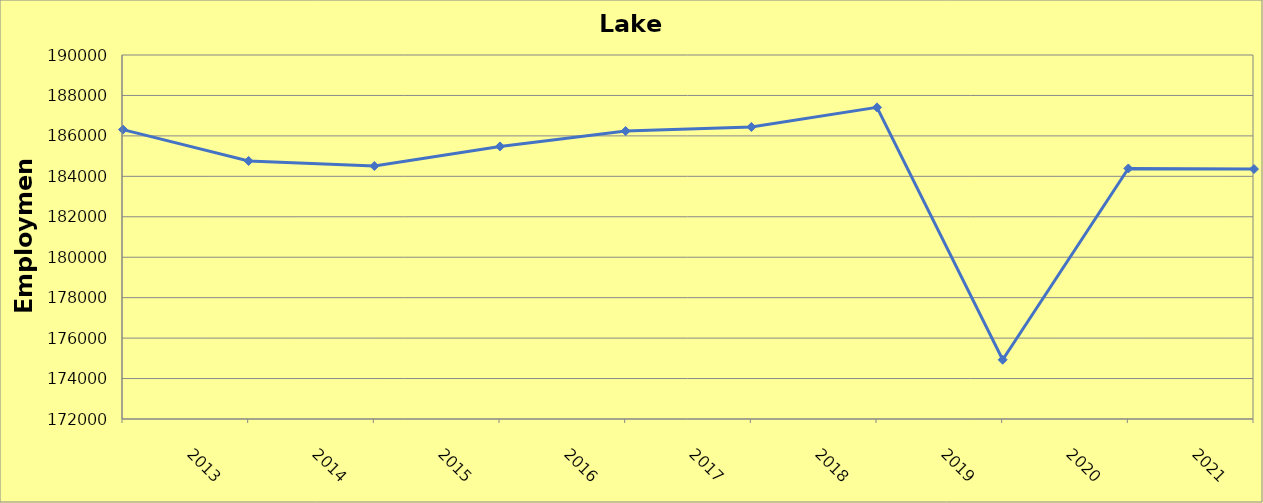
| Category | Lake County |
|---|---|
| 2013.0 | 186310 |
| 2014.0 | 184760 |
| 2015.0 | 184510 |
| 2016.0 | 185480 |
| 2017.0 | 186240 |
| 2018.0 | 186440 |
| 2019.0 | 187410 |
| 2020.0 | 174930 |
| 2021.0 | 184390 |
| 2022.0 | 184362 |